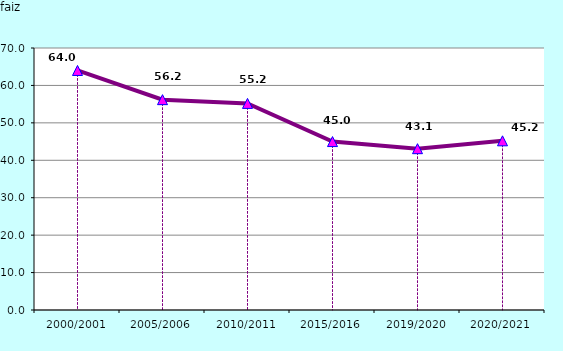
| Category | Series 1 | Series 2 |
|---|---|---|
| 2000/2001 | 64 |  |
| 2005/2006 | 56.2 |  |
| 2010/2011 | 55.2 |  |
| 2015/2016 | 45 |  |
| 2019/2020 | 43.1 |  |
| 2020/2021 | 45.2 |  |